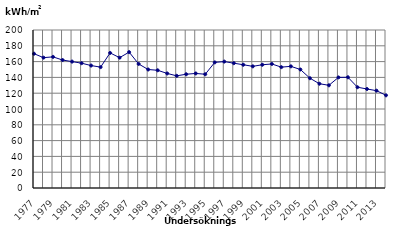
| Category | Elförbrukning |
|---|---|
| 1977.0 | 170 |
| 1978.0 | 165 |
| 1979.0 | 166 |
| 1980.0 | 162 |
| 1981.0 | 160 |
| 1982.0 | 158 |
| 1983.0 | 155 |
| 1984.0 | 153 |
| 1985.0 | 171 |
| 1986.0 | 165 |
| 1987.0 | 172 |
| 1988.0 | 157 |
| 1989.0 | 150 |
| 1990.0 | 149 |
| 1991.0 | 145 |
| 1992.0 | 142 |
| 1993.0 | 144 |
| 1994.0 | 145 |
| 1995.0 | 144 |
| 1996.0 | 159 |
| 1997.0 | 160 |
| 1998.0 | 158 |
| 1999.0 | 156 |
| 2000.0 | 154 |
| 2001.0 | 156 |
| 2002.0 | 157 |
| 2003.0 | 153 |
| 2004.0 | 154 |
| 2005.0 | 150 |
| 2006.0 | 139 |
| 2007.0 | 132 |
| 2008.0 | 130 |
| 2009.0 | 140.005 |
| 2010.0 | 140.154 |
| 2011.0 | 127.589 |
| 2012.0 | 125.319 |
| 2013.0 | 123.211 |
| 2014.0 | 117.307 |